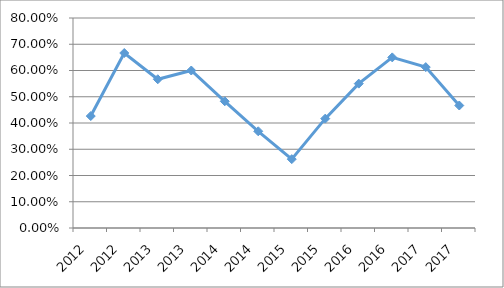
| Category | FISI-I1O21 |
|---|---|
| 2012.0 | 0.426 |
| 2012.0 | 0.667 |
| 2013.0 | 0.567 |
| 2013.0 | 0.6 |
| 2014.0 | 0.483 |
| 2014.0 | 0.368 |
| 2015.0 | 0.262 |
| 2015.0 | 0.417 |
| 2016.0 | 0.55 |
| 2016.0 | 0.65 |
| 2017.0 | 0.613 |
| 2017.0 | 0.467 |